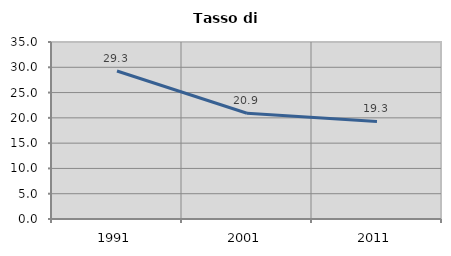
| Category | Tasso di disoccupazione   |
|---|---|
| 1991.0 | 29.256 |
| 2001.0 | 20.908 |
| 2011.0 | 19.303 |